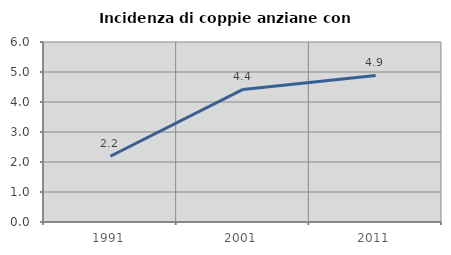
| Category | Incidenza di coppie anziane con figli |
|---|---|
| 1991.0 | 2.192 |
| 2001.0 | 4.421 |
| 2011.0 | 4.884 |